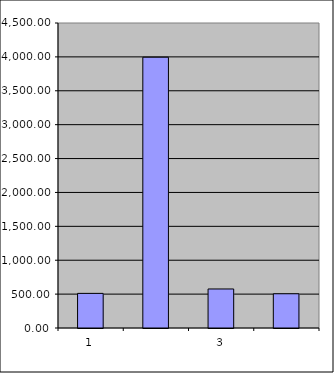
| Category | Series 0 |
|---|---|
| 0 | 510.75 |
| 1 | 3995.089 |
| 2 | 575.84 |
| 3 | 505.178 |